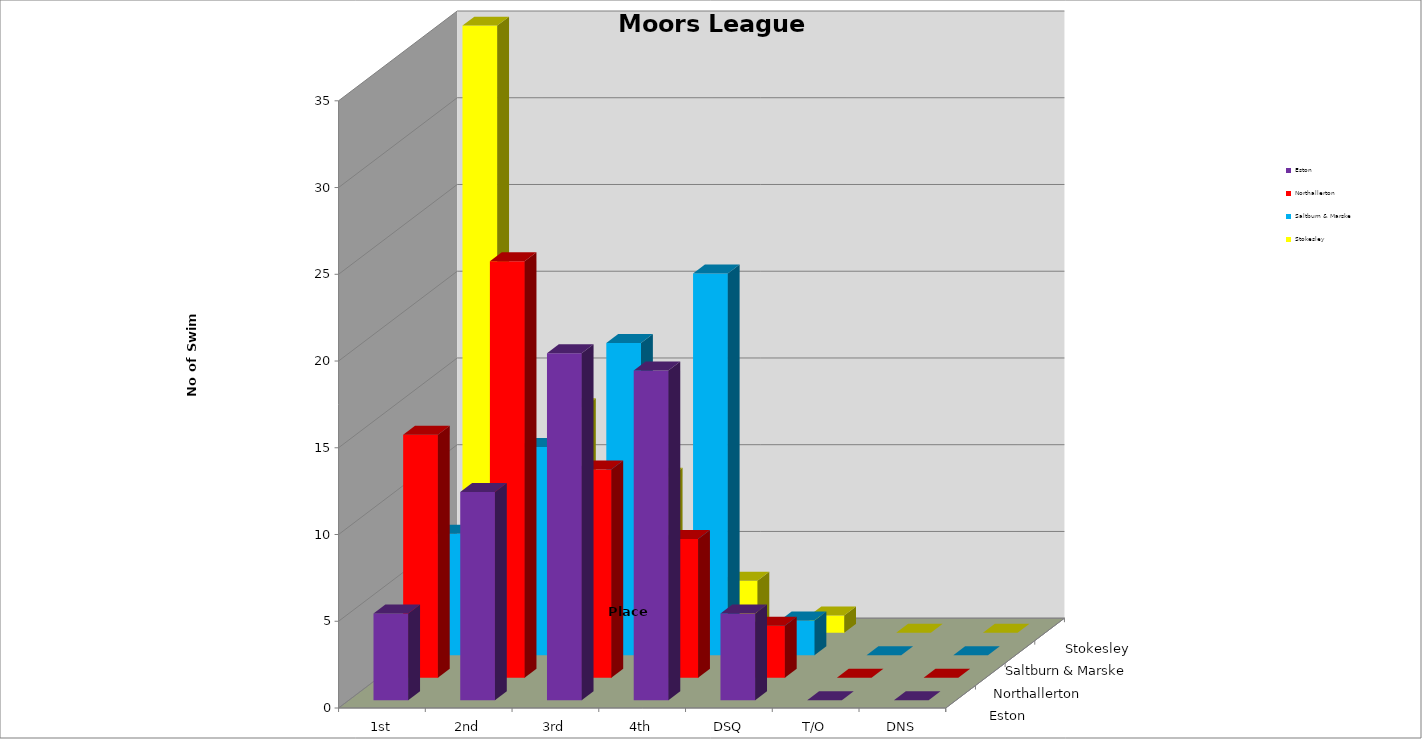
| Category | Eston | Northallerton | Saltburn & Marske | Stokesley |
|---|---|---|---|---|
| 1st | 5 | 14 | 7 | 35 |
| 2nd | 12 | 24 | 12 | 13 |
| 3rd | 20 | 12 | 18 | 9 |
| 4th | 19 | 8 | 22 | 3 |
| DSQ | 5 | 3 | 2 | 1 |
| T/O | 0 | 0 | 0 | 0 |
| DNS | 0 | 0 | 0 | 0 |